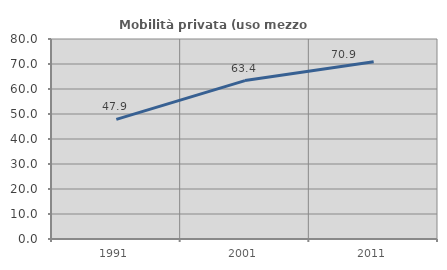
| Category | Mobilità privata (uso mezzo privato) |
|---|---|
| 1991.0 | 47.871 |
| 2001.0 | 63.36 |
| 2011.0 | 70.904 |